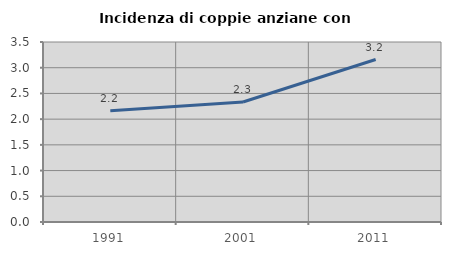
| Category | Incidenza di coppie anziane con figli |
|---|---|
| 1991.0 | 2.163 |
| 2001.0 | 2.332 |
| 2011.0 | 3.159 |